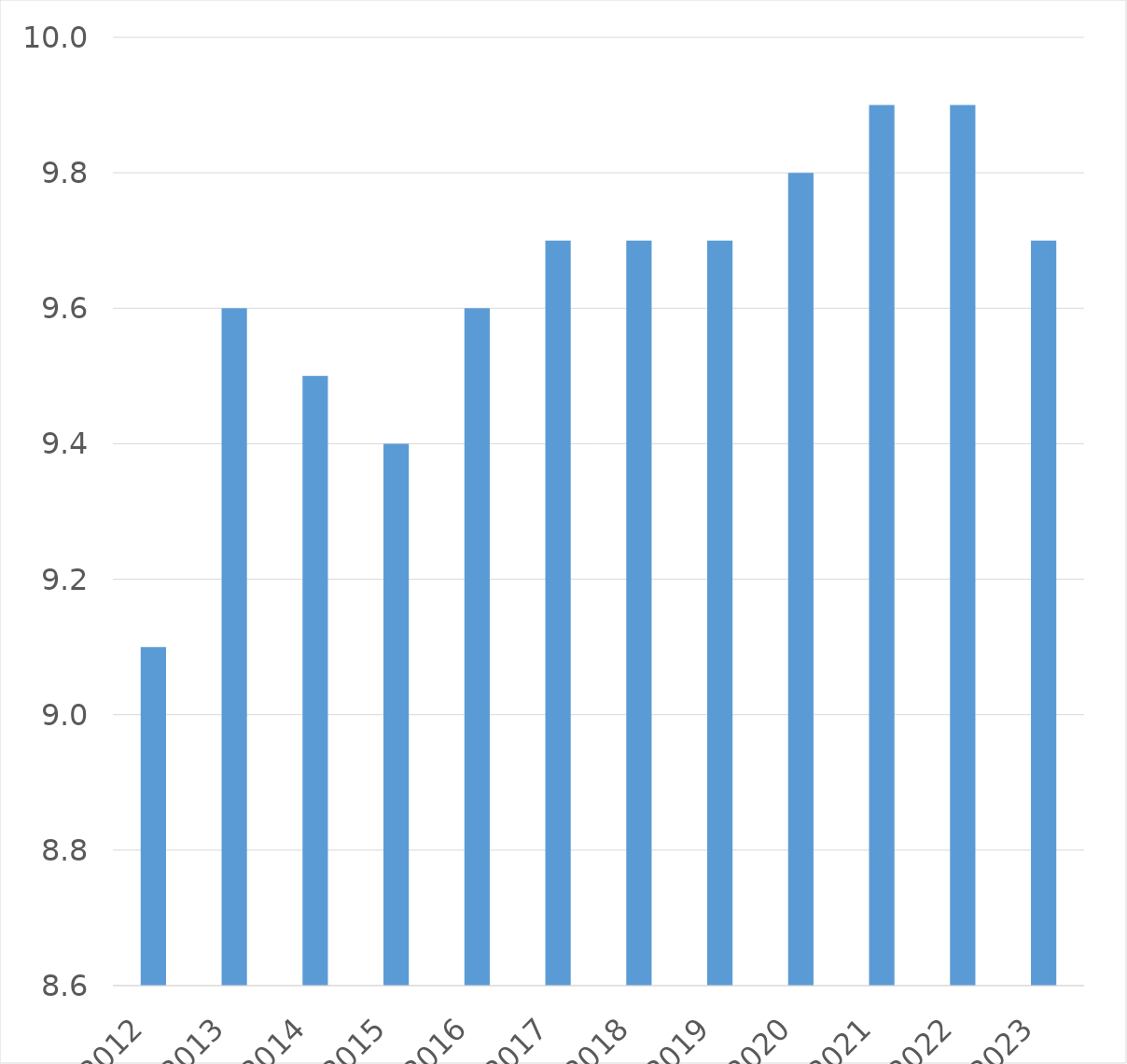
| Category | Series 0 |
|---|---|
| 2012 | 9.1 |
| 2013 | 9.6 |
| 2014 | 9.5 |
| 2015 | 9.4 |
| 2016 | 9.6 |
| 2017 | 9.7 |
| 2018 | 9.7 |
| 2019 | 9.7 |
| 2020 | 9.8 |
| 2021 | 9.9 |
| 2022 | 9.9 |
| 2023 | 9.7 |